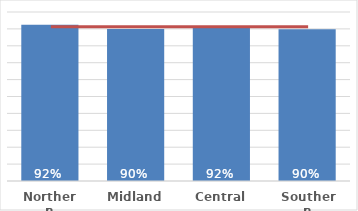
| Category | Total |
|---|---|
| Northern | 0.924 |
| Midland | 0.9 |
| Central | 0.916 |
| Southern | 0.897 |